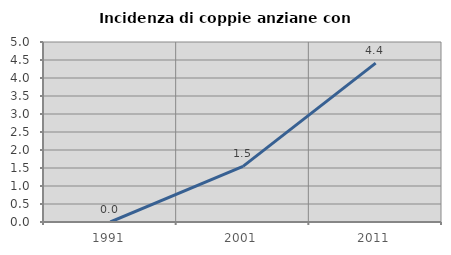
| Category | Incidenza di coppie anziane con figli |
|---|---|
| 1991.0 | 0 |
| 2001.0 | 1.546 |
| 2011.0 | 4.412 |